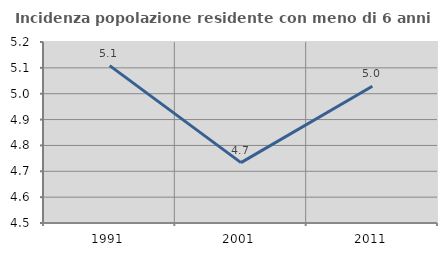
| Category | Incidenza popolazione residente con meno di 6 anni |
|---|---|
| 1991.0 | 5.108 |
| 2001.0 | 4.733 |
| 2011.0 | 5.029 |